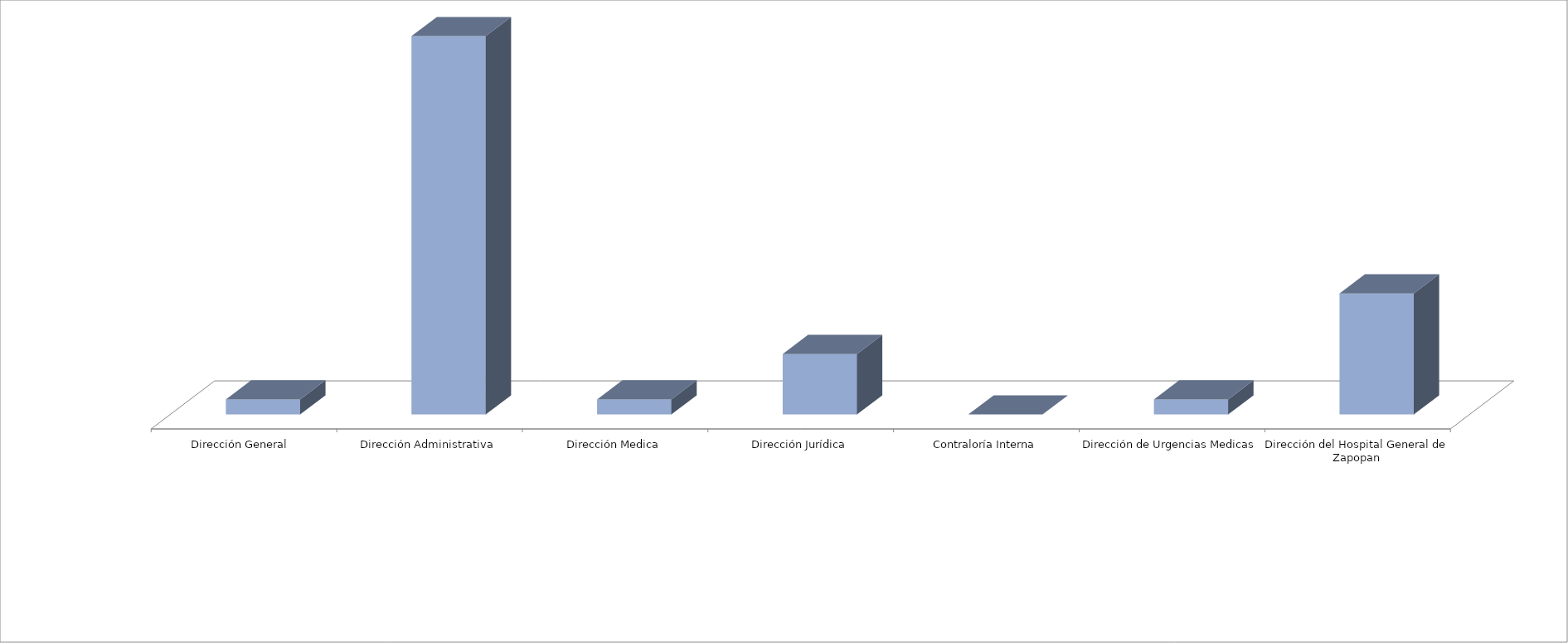
| Category | Series 0 | Series 1 |
|---|---|---|
| Dirección General  |  | 2 |
| Dirección Administrativa |  | 50 |
| Dirección Medica |  | 2 |
| Dirección Jurídica |  | 8 |
| Contraloría Interna |  | 0 |
| Dirección de Urgencias Medicas |  | 2 |
| Dirección del Hospital General de Zapopan |  | 16 |